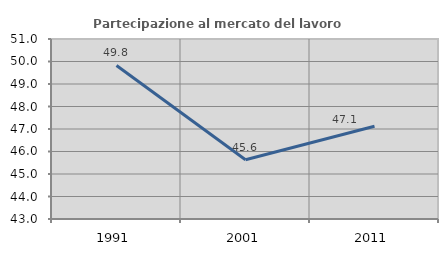
| Category | Partecipazione al mercato del lavoro  femminile |
|---|---|
| 1991.0 | 49.825 |
| 2001.0 | 45.635 |
| 2011.0 | 47.124 |